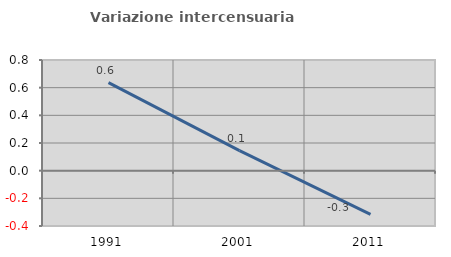
| Category | Variazione intercensuaria annua |
|---|---|
| 1991.0 | 0.637 |
| 2001.0 | 0.145 |
| 2011.0 | -0.316 |